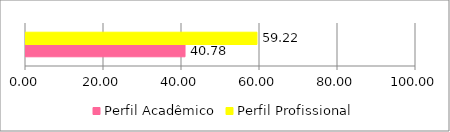
| Category | Perfil Acadêmico | Perfil Profissional |
|---|---|---|
| 0 | 40.777 | 59.223 |